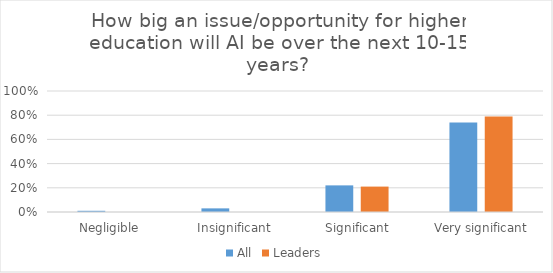
| Category | All | Leaders |
|---|---|---|
|  Negligible | 0.01 | 0 |
|  Insignificant | 0.03 | 0 |
|  Significant | 0.22 | 0.21 |
|  Very significant | 0.74 | 0.79 |